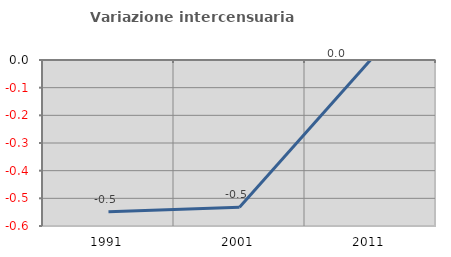
| Category | Variazione intercensuaria annua |
|---|---|
| 1991.0 | -0.549 |
| 2001.0 | -0.532 |
| 2011.0 | 0 |